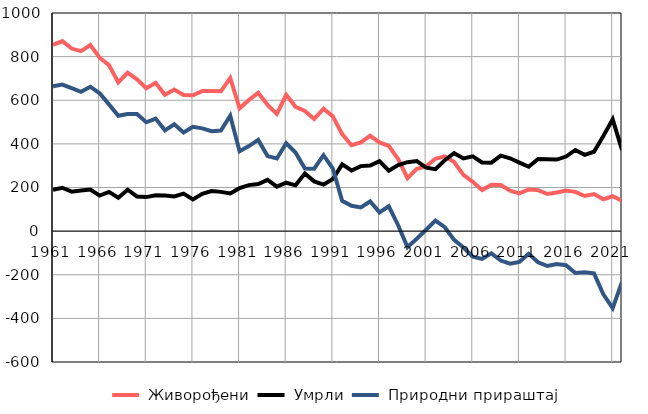
| Category |  Живорођени |  Умрли |  Природни прираштај |
|---|---|---|---|
| 1961.0 | 854 | 190 | 664 |
| 1962.0 | 871 | 199 | 672 |
| 1963.0 | 837 | 181 | 656 |
| 1964.0 | 825 | 186 | 639 |
| 1965.0 | 853 | 191 | 662 |
| 1966.0 | 795 | 163 | 632 |
| 1967.0 | 761 | 180 | 581 |
| 1968.0 | 682 | 153 | 529 |
| 1969.0 | 727 | 190 | 537 |
| 1970.0 | 696 | 159 | 537 |
| 1971.0 | 655 | 156 | 499 |
| 1972.0 | 680 | 164 | 516 |
| 1973.0 | 625 | 163 | 462 |
| 1974.0 | 649 | 159 | 490 |
| 1975.0 | 624 | 172 | 452 |
| 1976.0 | 623 | 145 | 478 |
| 1977.0 | 642 | 171 | 471 |
| 1978.0 | 642 | 184 | 458 |
| 1979.0 | 641 | 180 | 461 |
| 1980.0 | 702 | 173 | 529 |
| 1981.0 | 563 | 197 | 366 |
| 1982.0 | 601 | 211 | 390 |
| 1983.0 | 634 | 216 | 418 |
| 1984.0 | 579 | 235 | 344 |
| 1985.0 | 537 | 204 | 333 |
| 1986.0 | 625 | 222 | 403 |
| 1987.0 | 570 | 210 | 360 |
| 1988.0 | 551 | 264 | 287 |
| 1989.0 | 514 | 228 | 286 |
| 1990.0 | 561 | 213 | 348 |
| 1991.0 | 526 | 239 | 287 |
| 1992.0 | 445 | 306 | 139 |
| 1993.0 | 394 | 278 | 116 |
| 1994.0 | 407 | 298 | 109 |
| 1995.0 | 437 | 301 | 136 |
| 1996.0 | 407 | 321 | 86 |
| 1997.0 | 391 | 277 | 114 |
| 1998.0 | 330 | 303 | 27 |
| 1999.0 | 243 | 316 | -73 |
| 2000.0 | 286 | 321 | -35 |
| 2001.0 | 297 | 291 | 6 |
| 2002.0 | 332 | 284 | 48 |
| 2003.0 | 343 | 325 | 18 |
| 2004.0 | 317 | 357 | -40 |
| 2005.0 | 258 | 333 | -75 |
| 2006.0 | 226 | 343 | -117 |
| 2007.0 | 188 | 315 | -127 |
| 2008.0 | 212 | 314 | -102 |
| 2009.0 | 211 | 346 | -135 |
| 2010.0 | 185 | 334 | -149 |
| 2011.0 | 173 | 314 | -141 |
| 2012.0 | 191 | 295 | -104 |
| 2013.0 | 188 | 331 | -143 |
| 2014.0 | 170 | 330 | -160 |
| 2015.0 | 177 | 328 | -151 |
| 2016.0 | 186 | 342 | -156 |
| 2017.0 | 180 | 372 | -192 |
| 2018.0 | 161 | 350 | -189 |
| 2019.0 | 170 | 364 | -194 |
| 2020.0 | 146 | 436 | -290 |
| 2021.0 | 160 | 513 | -353 |
| 2022.0 | 139 | 372 | -233 |